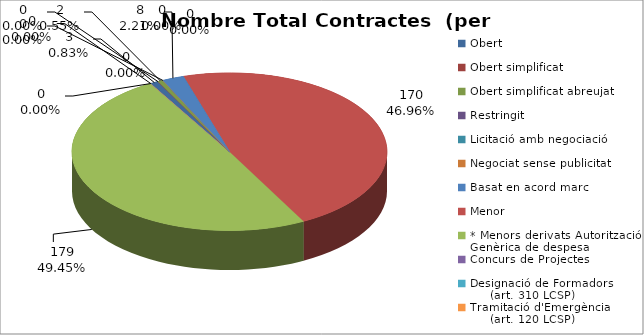
| Category | Nombre Total Contractes |
|---|---|
| Obert | 3 |
| Obert simplificat | 0 |
| Obert simplificat abreujat | 2 |
| Restringit | 0 |
| Licitació amb negociació | 0 |
| Negociat sense publicitat | 0 |
| Basat en acord marc | 8 |
| Menor | 170 |
| * Menors derivats Autorització Genèrica de despesa | 179 |
| Concurs de Projectes | 0 |
| Designació de Formadors
     (art. 310 LCSP) | 0 |
| Tramitació d'Emergència
     (art. 120 LCSP) | 0 |